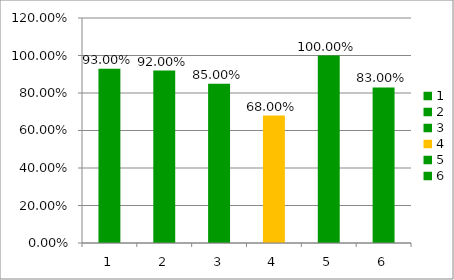
| Category | Series 0 |
|---|---|
| 0 | 0.93 |
| 1 | 0.92 |
| 2 | 0.85 |
| 3 | 0.68 |
| 4 | 1 |
| 5 | 0.83 |